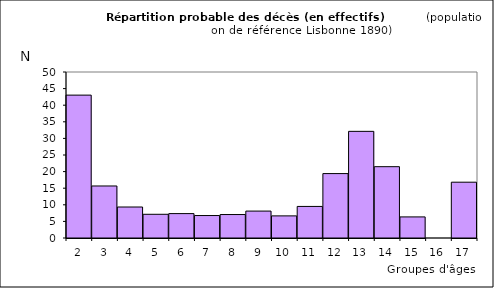
| Category | Series 0 |
|---|---|
| 2.0 | 43.039 |
| 3.0 | 15.672 |
| 4.0 | 9.334 |
| 5.0 | 7.143 |
| 6.0 | 7.347 |
| 7.0 | 6.767 |
| 8.0 | 7.068 |
| 9.0 | 8.106 |
| 10.0 | 6.662 |
| 11.0 | 9.507 |
| 12.0 | 19.4 |
| 13.0 | 32.121 |
| 14.0 | 21.481 |
| 15.0 | 6.352 |
| 16.0 | 0 |
| 17.0 | 16.809 |